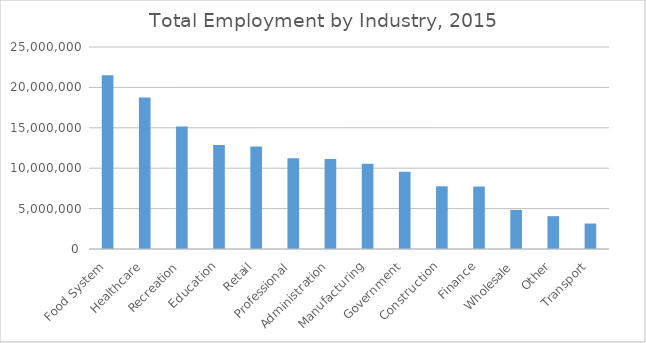
| Category | Employment |
|---|---|
| Food System | 21505450 |
| Healthcare | 18738850 |
| Recreation | 15165810 |
| Education | 12861660 |
| Retail | 12697360 |
| Professional | 11232050 |
| Administration | 11141960 |
| Manufacturing | 10549050 |
| Government | 9547400 |
| Construction | 7758290 |
| Finance | 7731930 |
| Wholesale | 4836540 |
| Other | 4061960 |
| Transport | 3153190 |